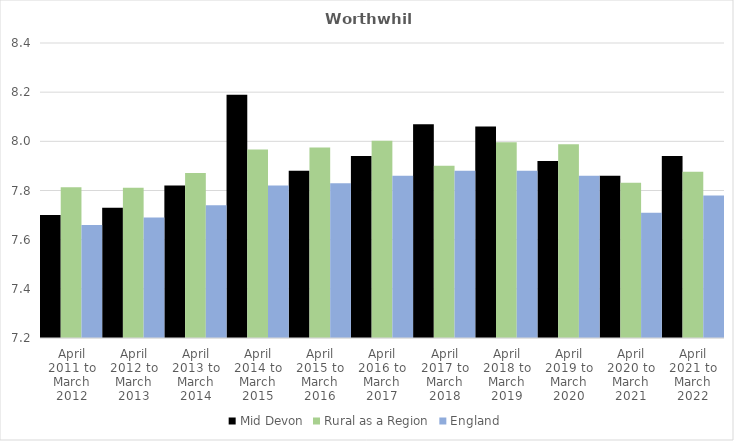
| Category | Mid Devon | Rural as a Region | England |
|---|---|---|---|
| April 2011 to March 2012 | 7.7 | 7.813 | 7.66 |
| April 2012 to March 2013 | 7.73 | 7.811 | 7.69 |
| April 2013 to March 2014 | 7.82 | 7.871 | 7.74 |
| April 2014 to March 2015 | 8.19 | 7.967 | 7.82 |
| April 2015 to March 2016 | 7.88 | 7.975 | 7.83 |
| April 2016 to March 2017 | 7.94 | 8.002 | 7.86 |
| April 2017 to March 2018 | 8.07 | 7.9 | 7.88 |
| April 2018 to March 2019 | 8.06 | 7.996 | 7.88 |
| April 2019 to March 2020 | 7.92 | 7.988 | 7.86 |
| April 2020 to March 2021 | 7.86 | 7.831 | 7.71 |
| April 2021 to March 2022 | 7.94 | 7.877 | 7.78 |